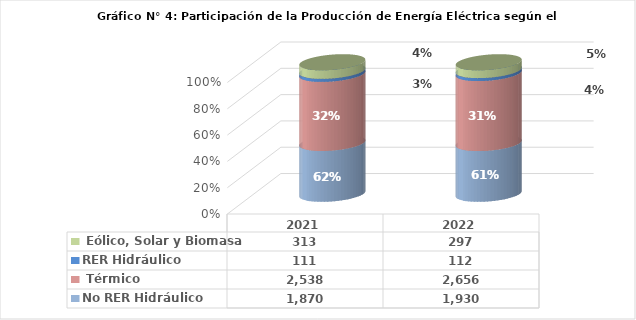
| Category | No RER Hidráulico | No RER Térmico | RER Hidráulico | RER Eólico, Solar y Biomasa |
|---|---|---|---|---|
| 2021.0 | 1869.824 | 2537.995 | 111.17 | 312.849 |
| 2022.0 | 1930.393 | 2655.992 | 111.72 | 296.573 |